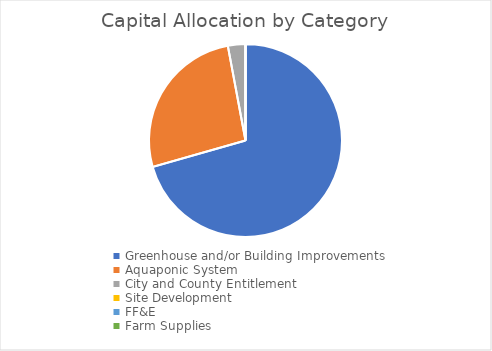
| Category | Series 0 |
|---|---|
| Greenhouse and/or Building Improvements | 120000 |
| Aquaponic System | 45000 |
| City and County Entitlement | 5000 |
| Site Development | 0 |
| FF&E | 0 |
| Farm Supplies | 0 |